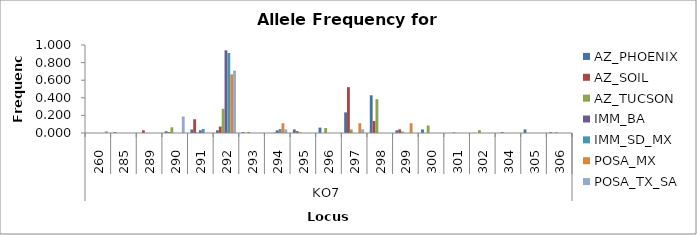
| Category | AZ_PHOENIX | AZ_SOIL | AZ_TUCSON | IMM_BA | IMM_SD_MX | POSA_MX | POSA_TX_SA |
|---|---|---|---|---|---|---|---|
| 0 | 0 | 0 | 0 | 0 | 0 | 0 | 0.021 |
| 1 | 0.01 | 0 | 0 | 0 | 0 | 0 | 0 |
| 2 | 0 | 0.031 | 0 | 0 | 0 | 0 | 0 |
| 3 | 0.02 | 0.01 | 0.065 | 0 | 0 | 0 | 0.188 |
| 4 | 0.041 | 0.156 | 0.004 | 0.03 | 0.045 | 0 | 0 |
| 5 | 0.031 | 0.073 | 0.275 | 0.939 | 0.909 | 0.667 | 0.708 |
| 6 | 0.01 | 0 | 0.012 | 0 | 0 | 0 | 0 |
| 7 | 0 | 0 | 0.004 | 0.03 | 0.045 | 0.111 | 0.042 |
| 8 | 0.041 | 0.021 | 0.008 | 0 | 0 | 0 | 0 |
| 9 | 0.061 | 0 | 0.057 | 0 | 0 | 0 | 0 |
| 10 | 0.235 | 0.521 | 0.04 | 0 | 0 | 0.111 | 0.042 |
| 11 | 0.429 | 0.135 | 0.385 | 0 | 0 | 0 | 0 |
| 12 | 0.031 | 0.042 | 0.016 | 0 | 0 | 0.111 | 0 |
| 13 | 0.041 | 0 | 0.085 | 0 | 0 | 0 | 0 |
| 14 | 0 | 0 | 0.008 | 0 | 0 | 0 | 0 |
| 15 | 0 | 0 | 0.032 | 0 | 0 | 0 | 0 |
| 16 | 0 | 0.01 | 0 | 0 | 0 | 0 | 0 |
| 17 | 0.041 | 0 | 0 | 0 | 0 | 0 | 0 |
| 18 | 0.01 | 0 | 0.008 | 0 | 0 | 0 | 0 |